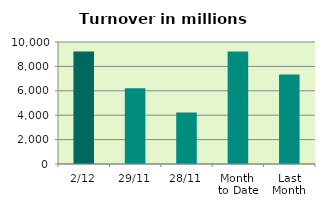
| Category | Series 0 |
|---|---|
| 2/12 | 9222.632 |
| 29/11 | 6219.132 |
| 28/11 | 4218.608 |
| Month 
to Date | 9222.632 |
| Last
Month | 7326.344 |